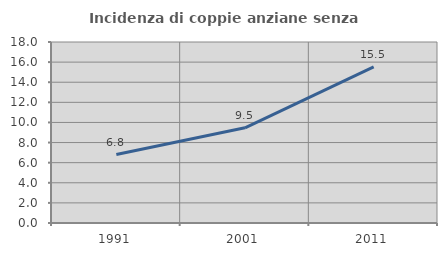
| Category | Incidenza di coppie anziane senza figli  |
|---|---|
| 1991.0 | 6.803 |
| 2001.0 | 9.466 |
| 2011.0 | 15.52 |